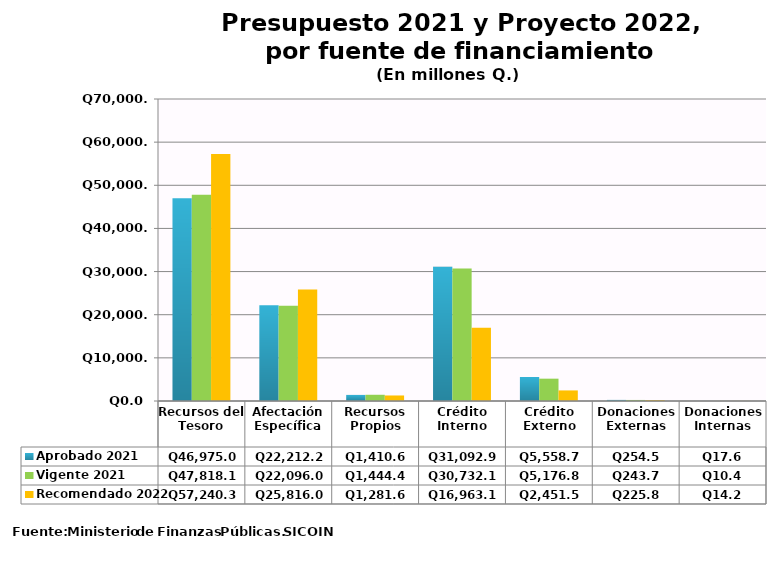
| Category | Aprobado 2021 | Vigente 2021 | Recomendado 2022 |
|---|---|---|---|
| Recursos del Tesoro | 46975 | 47818.1 | 57240.3 |
| Afectación Específica | 22212.2 | 22096 | 25816 |
| Recursos Propios | 1410.6 | 1444.4 | 1281.6 |
| Crédito Interno | 31092.9 | 30732.1 | 16963.1 |
| Crédito Externo | 5558.7 | 5176.8 | 2451.5 |
| Donaciones Externas | 254.5 | 243.7 | 225.8 |
| Donaciones Internas | 17.6 | 10.4 | 14.2 |